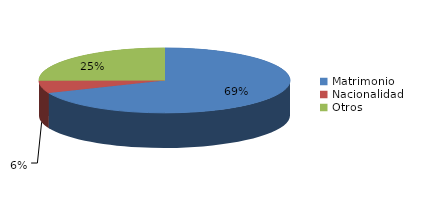
| Category | Series 0 |
|---|---|
| Matrimonio | 1151 |
| Nacionalidad | 104 |
| Otros | 422 |